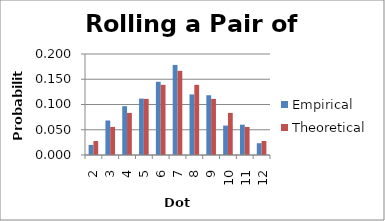
| Category | Empirical | Theoretical |
|---|---|---|
| 2.0 | 0.02 | 0.028 |
| 3.0 | 0.068 | 0.056 |
| 4.0 | 0.097 | 0.083 |
| 5.0 | 0.112 | 0.111 |
| 6.0 | 0.145 | 0.139 |
| 7.0 | 0.178 | 0.167 |
| 8.0 | 0.12 | 0.139 |
| 9.0 | 0.118 | 0.111 |
| 10.0 | 0.058 | 0.083 |
| 11.0 | 0.06 | 0.056 |
| 12.0 | 0.023 | 0.028 |